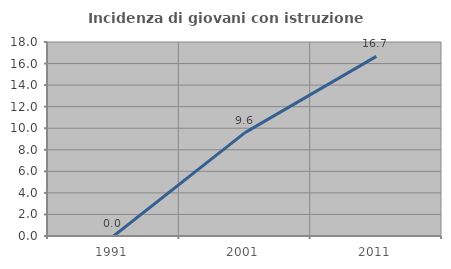
| Category | Incidenza di giovani con istruzione universitaria |
|---|---|
| 1991.0 | 0 |
| 2001.0 | 9.589 |
| 2011.0 | 16.667 |